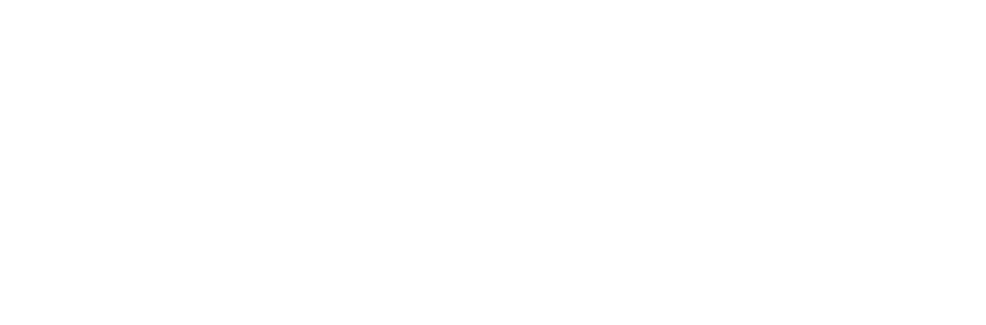
| Category | Total |
|---|---|
| 0 | 0.14 |
| 1 | 0.231 |
| 2 | 0.436 |
| 3 | 0.148 |
| 4 | 0.045 |